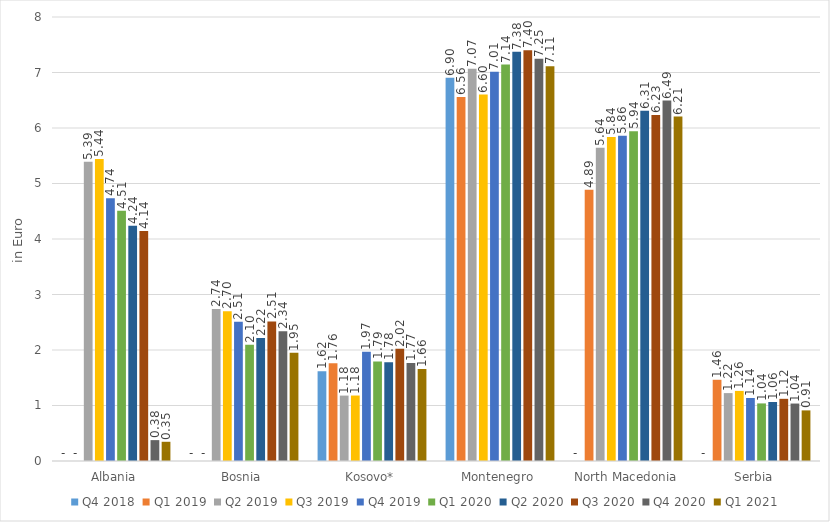
| Category | Q4 2018 | Q1 2019 | Q2 2019 | Q3 2019 | Q4 2019 | Q1 2020 | Q2 2020 | Q3 2020 | Q4 2020 | Q1 2021 |
|---|---|---|---|---|---|---|---|---|---|---|
| Albania | 0 | 0 | 5.393 | 5.442 | 4.736 | 4.51 | 4.238 | 4.143 | 0.376 | 0.346 |
| Bosnia | 0 | 0 | 2.741 | 2.7 | 2.509 | 2.095 | 2.218 | 2.515 | 2.338 | 1.95 |
| Kosovo* | 1.619 | 1.762 | 1.178 | 1.18 | 1.97 | 1.793 | 1.779 | 2.024 | 1.766 | 1.657 |
| Montenegro | 6.904 | 6.558 | 7.068 | 6.602 | 7.014 | 7.143 | 7.376 | 7.399 | 7.247 | 7.113 |
| North Macedonia | 0 | 4.886 | 5.643 | 5.839 | 5.862 | 5.943 | 6.309 | 6.234 | 6.493 | 6.206 |
| Serbia | 0 | 1.464 | 1.223 | 1.263 | 1.135 | 1.038 | 1.063 | 1.12 | 1.035 | 0.912 |